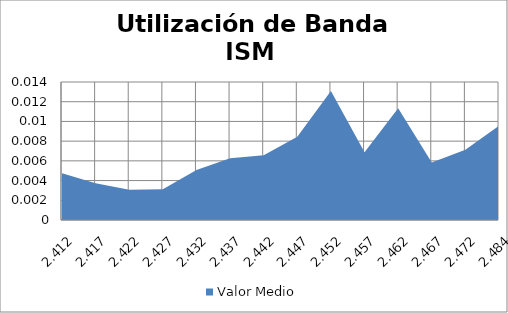
| Category | Valor Medio |
|---|---|
| 2.412 | 0.005 |
| 2.417 | 0.004 |
| 2.4219999999999997 | 0.003 |
| 2.4269999999999996 | 0.003 |
| 2.4319999999999995 | 0.005 |
| 2.4369999999999994 | 0.006 |
| 2.4419999999999993 | 0.007 |
| 2.446999999999999 | 0.008 |
| 2.451999999999999 | 0.013 |
| 2.456999999999999 | 0.007 |
| 2.461999999999999 | 0.011 |
| 2.4669999999999987 | 0.006 |
| 2.4719999999999986 | 0.007 |
| 2.484 | 0.01 |